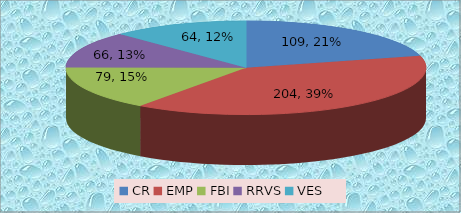
| Category | Series 0 |
|---|---|
| CR | 109 |
| EMP | 204 |
| FBI | 79 |
| RRVS | 66 |
| VES | 64 |